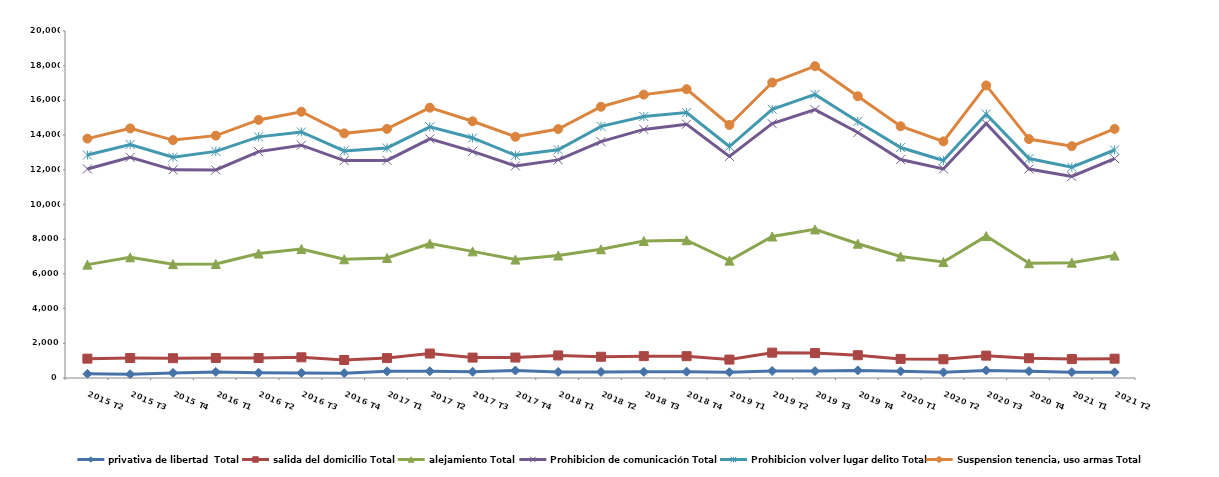
| Category | privativa de libertad  Total | salida del domicilio Total | alejamiento Total | Prohibicion de comunicación Total | Prohibicion volver lugar delito Total | Suspension tenencia, uso armas Total |
|---|---|---|---|---|---|---|
| 2015 T2 | 238 | 877 | 5419 | 5513 | 802 | 948 |
| 2015 T3 | 216 | 937 | 5800 | 5766 | 739 | 929 |
| 2015 T4 | 295 | 846 | 5420 | 5437 | 727 | 988 |
| 2016 T1 | 351 | 803 | 5416 | 5420 | 1072 | 908 |
| 2016 T2 | 306 | 846 | 6022 | 5873 | 852 | 975 |
| 2016 T3 | 295 | 898 | 6241 | 5985 | 762 | 1166 |
| 2016 T4 | 280 | 757 | 5807 | 5686 | 560 | 1010 |
| 2017 T1 | 385 | 763 | 5769 | 5625 | 720 | 1097 |
| 2017 T2 | 389 | 1020 | 6337 | 6036 | 695 | 1103 |
| 2017 T3 | 360 | 817 | 6122 | 5765 | 770 | 963 |
| 2017 T4 | 432 | 747 | 5646 | 5399 | 610 | 1069 |
| 2018 T1 | 350 | 950 | 5758 | 5513 | 585 | 1196 |
| 2018 T2 | 352 | 872 | 6194 | 6206 | 877 | 1133 |
| 2018 T3 | 354 | 906 | 6638 | 6430 | 743 | 1263 |
| 2018 T4 | 364 | 894 | 6685 | 6685 | 670 | 1349 |
| 2019 T1 | 334 | 727 | 5704 | 6003 | 573 | 1243 |
| 2019 T2 | 406 | 1055 | 6694 | 6504 | 827 | 1543 |
| 2019 T3 | 401 | 1035 | 7130 | 6902 | 880 | 1624 |
| 2019 T4 | 437 | 876 | 6426 | 6409 | 640 | 1450 |
| 2020 T1 | 387 | 713 | 5904 | 5586 | 692 | 1228 |
| 2020 T2 | 325 | 755 | 5603 | 5367 | 488 | 1099 |
| 2020 T3 | 437 | 852 | 6890 | 6487 | 545 | 1652 |
| 2020 T4 | 395 | 744 | 5474 | 5429 | 606 | 1122 |
| 2021 T1 | 336 | 755 | 5558 | 4967 | 536 | 1211 |
| 2021 T2 | 326 | 788 | 5945 | 5586 | 497 | 1215 |